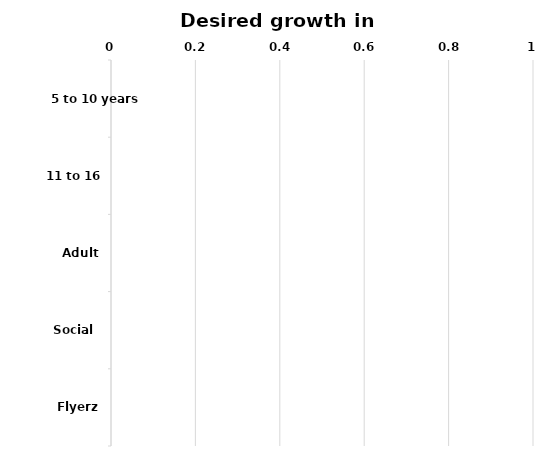
| Category | Desired Growth of Coached Players |
|---|---|
| 5 to 10 years | 0 |
| 11 to 16 years | 0 |
| Adult | 0 |
| Social  | 0 |
| Flyerz | 0 |